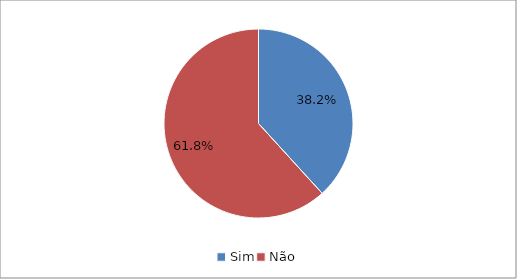
| Category | Series 0 |
|---|---|
| Sim | 0.382 |
| Não | 0.618 |